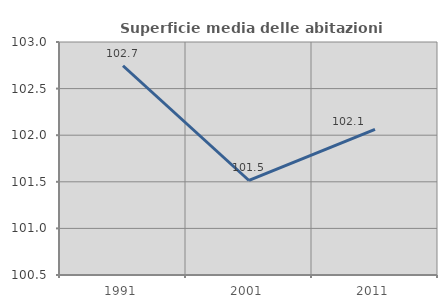
| Category | Superficie media delle abitazioni occupate |
|---|---|
| 1991.0 | 102.745 |
| 2001.0 | 101.514 |
| 2011.0 | 102.063 |